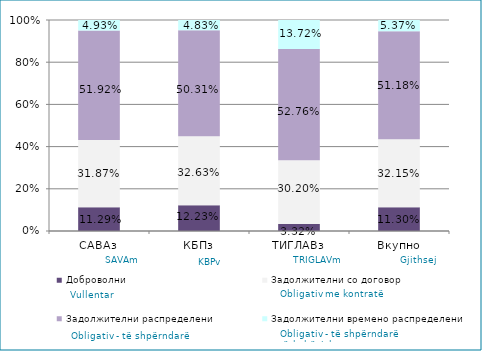
| Category | Доброволни  | Задолжителни со договор  | Задолжителни распределени  | Задолжителни времено распределени  |
|---|---|---|---|---|
| САВАз | 0.113 | 0.319 | 0.519 | 0.049 |
| КБПз | 0.122 | 0.326 | 0.503 | 0.048 |
| ТИГЛАВз | 0.033 | 0.302 | 0.528 | 0.137 |
| Вкупно | 0.113 | 0.321 | 0.512 | 0.054 |